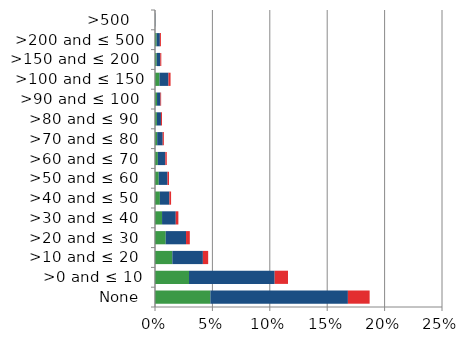
| Category | England | Scotland | Wales |
|---|---|---|---|
|  None | 0.048 | 0.12 | 0.019 |
| >0 and ≤ 10 | 0.03 | 0.075 | 0.012 |
| >10 and ≤ 20  | 0.015 | 0.027 | 0.005 |
| >20 and ≤ 30  | 0.009 | 0.018 | 0.003 |
| >30 and ≤ 40  | 0.006 | 0.012 | 0.002 |
| >40 and ≤ 50  | 0.004 | 0.008 | 0.001 |
| >50 and ≤ 60  | 0.003 | 0.008 | 0.001 |
| >60 and ≤ 70  | 0.002 | 0.007 | 0.001 |
| >70 and ≤ 80  | 0.002 | 0.005 | 0.001 |
| >80 and ≤ 90  | 0.002 | 0.004 | 0.001 |
| >90 and ≤ 100  | 0.002 | 0.003 | 0.001 |
| >100 and ≤ 150 | 0.004 | 0.008 | 0.002 |
| >150 and ≤ 200  | 0.002 | 0.003 | 0.001 |
| >200 and ≤ 500 | 0.001 | 0.003 | 0.001 |
| >500   | 0 | 0 | 0 |